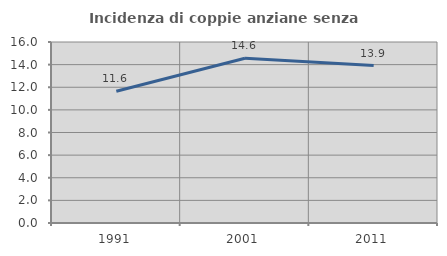
| Category | Incidenza di coppie anziane senza figli  |
|---|---|
| 1991.0 | 11.649 |
| 2001.0 | 14.564 |
| 2011.0 | 13.915 |